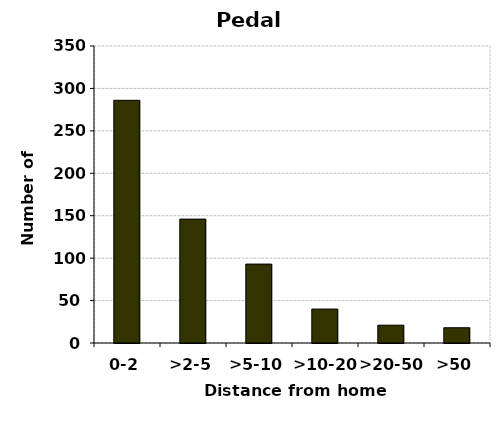
| Category | Pedal cycles |
|---|---|
| 0-2 | 286 |
| >2-5 | 146 |
| >5-10 | 93 |
| >10-20 | 40 |
| >20-50 | 21 |
| >50 | 18 |